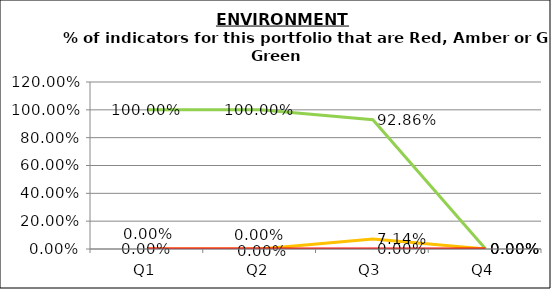
| Category | Green | Amber | Red |
|---|---|---|---|
| Q1 | 1 | 0 | 0 |
| Q2 | 1 | 0 | 0 |
| Q3 | 0.929 | 0.071 | 0 |
| Q4 | 0 | 0 | 0 |